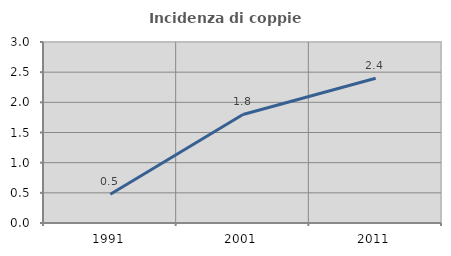
| Category | Incidenza di coppie miste |
|---|---|
| 1991.0 | 0.477 |
| 2001.0 | 1.799 |
| 2011.0 | 2.398 |